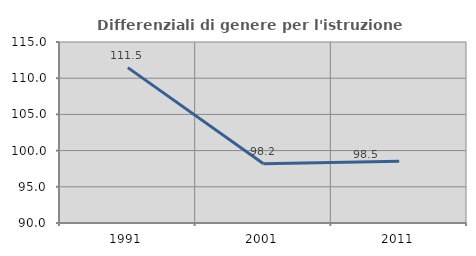
| Category | Differenziali di genere per l'istruzione superiore |
|---|---|
| 1991.0 | 111.459 |
| 2001.0 | 98.18 |
| 2011.0 | 98.518 |